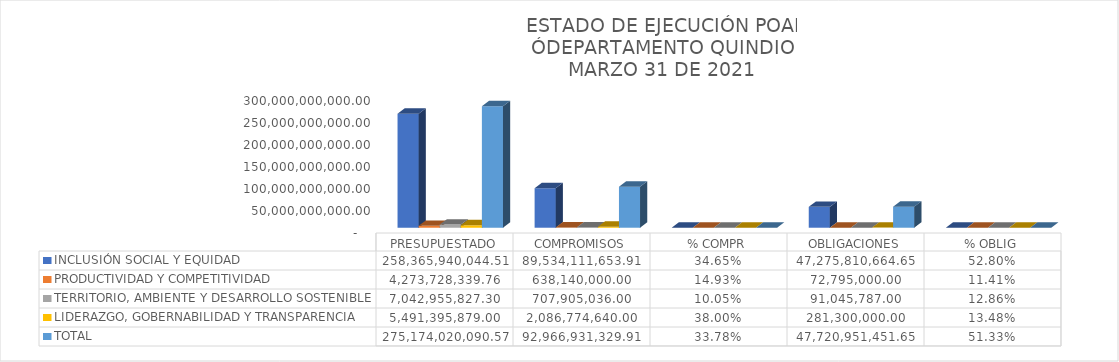
| Category | INCLUSIÓN SOCIAL Y EQUIDAD  | PRODUCTIVIDAD Y COMPETITIVIDAD | TERRITORIO, AMBIENTE Y DESARROLLO SOSTENIBLE  | LIDERAZGO, GOBERNABILIDAD Y TRANSPARENCIA  | TOTAL |
|---|---|---|---|---|---|
| PRESUPUESTADO | 258365940044.51 | 4273728339.76 | 7042955827.3 | 5491395879 | 275174020090.57 |
| COMPROMISOS | 89534111653.91 | 638140000 | 707905036 | 2086774640 | 92966931329.91 |
| % COMPR | 0.347 | 0.149 | 0.101 | 0.38 | 0.338 |
| OBLIGACIONES | 47275810664.65 | 72795000 | 91045787 | 281300000 | 47720951451.65 |
| % OBLIG | 0.528 | 0.114 | 0.129 | 0.135 | 0.513 |